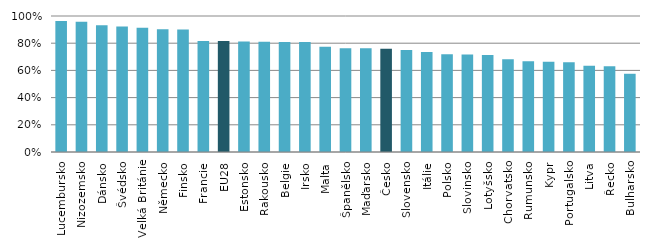
| Category | bez dětí |
|---|---|
| Lucembursko | 0.964 |
| Nizozemsko | 0.958 |
| Dánsko | 0.931 |
| Švédsko | 0.924 |
| Velká Británie | 0.913 |
| Německo | 0.902 |
| Finsko | 0.901 |
| Francie | 0.816 |
| EU28 | 0.816 |
| Estonsko | 0.813 |
| Rakousko | 0.811 |
| Belgie | 0.81 |
| Irsko | 0.809 |
| Malta | 0.774 |
| Španělsko | 0.763 |
| Maďarsko | 0.762 |
| Česko | 0.759 |
| Slovensko | 0.751 |
| Itálie | 0.735 |
| Polsko | 0.719 |
| Slovinsko | 0.717 |
| Lotyšsko | 0.713 |
| Chorvatsko | 0.681 |
| Rumunsko | 0.667 |
| Kypr | 0.663 |
| Portugalsko | 0.66 |
| Litva | 0.634 |
| Řecko | 0.63 |
| Bulharsko | 0.575 |